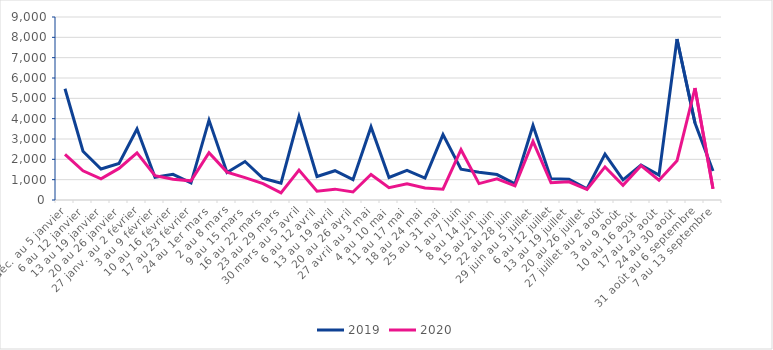
| Category | 2019 | 2020 |
|---|---|---|
| 30 déc. au 5 janvier | 5470 | 2246 |
| 6 au 12 janvier | 2400 | 1436 |
| 13 au 19 janvier | 1527 | 1041 |
| 20 au 26 janvier | 1798 | 1553 |
| 27 janv. au 2 février | 3495 | 2319 |
| 3 au 9 février | 1116 | 1195 |
| 10 au 16 février | 1260 | 1018 |
| 17 au 23 février | 841 | 943 |
| 24 au 1er mars | 3928 | 2327 |
| 2 au 8 mars | 1349 | 1373 |
| 9 au 15 mars | 1893 | 1099 |
| 16 au 22 mars | 1068 | 807 |
| 23 au 29 mars | 828 | 348 |
| 30 mars au 5 avril | 4105 | 1472 |
| 6 au 12 avril | 1156 | 433 |
| 13 au 19 avril | 1440 | 534 |
| 20 au 26 avril | 1002 | 395 |
| 27 avril au 3 mai | 3595 | 1255 |
| 4 au 10 mai | 1106 | 603 |
| 11 au 17 mai | 1456 | 796 |
| 18 au 24 mai | 1078 | 593 |
| 25 au 31 mai | 3215 | 532 |
| 1 au 7 juin | 1515 | 2472 |
| 8 au 14 juin | 1366 | 806 |
| 15 au 21 juin | 1252 | 1042 |
| 22 au 28 juin | 799 | 694 |
| 29 juin au 5 juillet | 3667 | 2886 |
| 6 au 12 juillet | 1051 | 847 |
| 13 au 19 juillet | 1024 | 896 |
| 20 au 26 juillet | 555 | 518 |
| 27 juillet au 2 août | 2260 | 1628 |
| 3 au 9 août | 993 | 724 |
| 10 au 16 août  | 1713 | 1691 |
| 17 au 23 août | 1221 | 970 |
| 24 au 30 août | 7919 | 1931 |
| 31 août au 6 septembre | 3784 | 5503 |
| 7 au 13 septembre | 1424 | 550 |